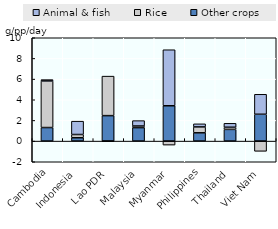
| Category | Other crops | Rice | Animal & fish |
|---|---|---|---|
| Cambodia | 1.311 | 4.511 | 0.129 |
| Indonesia | 0.323 | 0.313 | 1.292 |
| Lao PDR | 2.463 | 3.824 | -0.029 |
| Malaysia | 1.303 | 0.157 | 0.521 |
| Myanmar | 3.418 | -0.387 | 5.422 |
| Philippines | 0.802 | 0.571 | 0.298 |
| Thailand | 1.133 | 0.206 | 0.382 |
| Viet Nam | 2.596 | -0.989 | 1.934 |